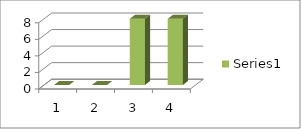
| Category | Series 0 |
|---|---|
| 0 | 0 |
| 1 | 0 |
| 2 | 8 |
| 3 | 8 |